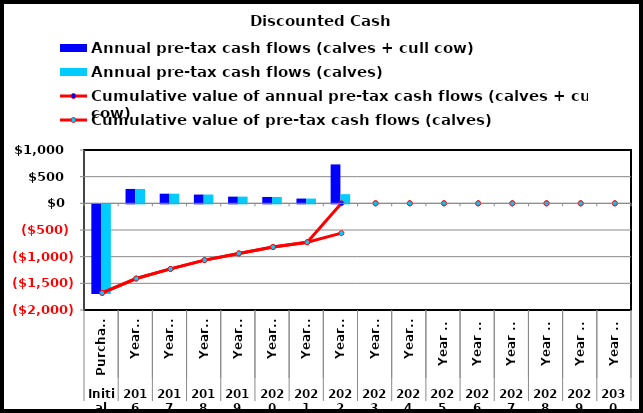
| Category | Annual pre-tax cash flows (calves + cull cow) | Annual pre-tax cash flows (calves) |
|---|---|---|
| 0 | -1680 | -1680 |
| 1 | 269.905 | 269.905 |
| 2 | 180.862 | 180.862 |
| 3 | 164.82 | 164.82 |
| 4 | 125.544 | 125.544 |
| 5 | 119.566 | 119.566 |
| 6 | 89.62 | 89.62 |
| 7 | 729.834 | 171.239 |
| 8 | 0 | 0 |
| 9 | 0 | 0 |
| 10 | 0 | 0 |
| 11 | 0 | 0 |
| 12 | 0 | 0 |
| 13 | 0 | 0 |
| 14 | 0 | 0 |
| 15 | 0 | 0 |